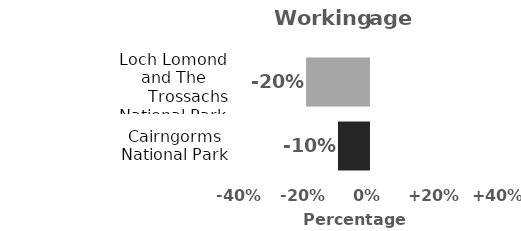
| Category | Working age |
|---|---|
| Cairngorms National Park | -9.697 |
| Loch Lomond and The
      Trossachs National Park | -19.66 |